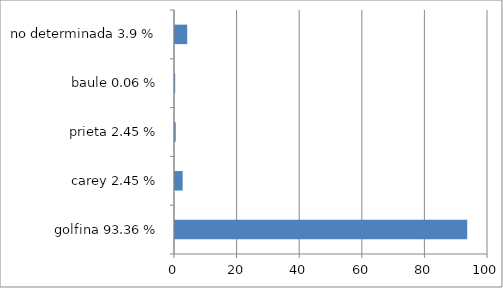
| Category | Series 0 |
|---|---|
| golfina 93.36 % | 93.36 |
| carey 2.45 % | 2.45 |
| prieta 2.45 % | 0.23 |
| baule 0.06 % | 0.06 |
| no determinada 3.9 % | 3.9 |